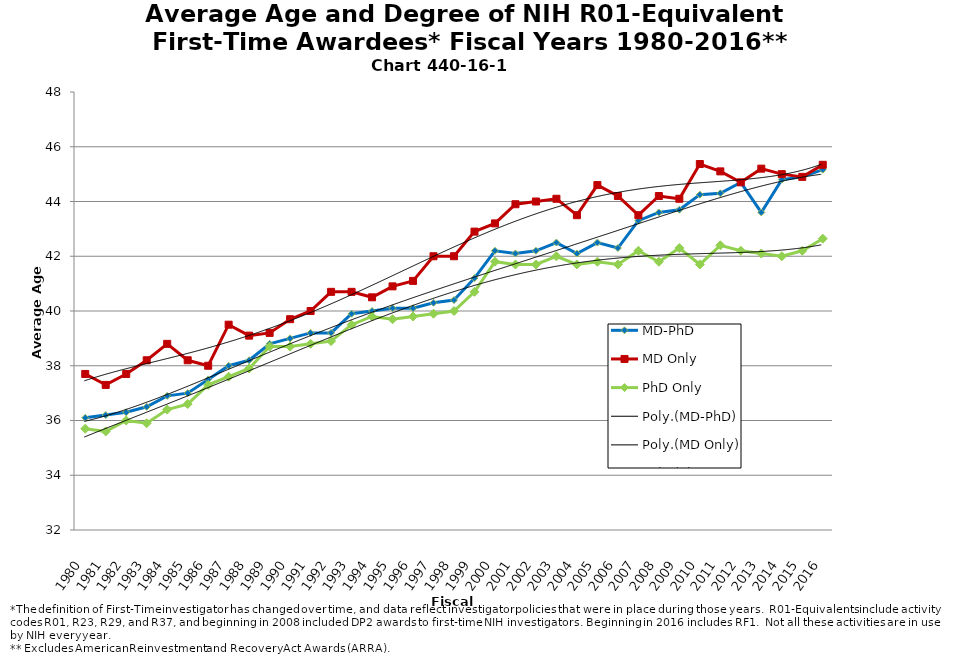
| Category | MD-PhD | MD Only | PhD Only |
|---|---|---|---|
| 1980.0 | 36.1 | 37.7 | 35.7 |
| 1981.0 | 36.2 | 37.3 | 35.6 |
| 1982.0 | 36.3 | 37.7 | 36 |
| 1983.0 | 36.5 | 38.2 | 35.9 |
| 1984.0 | 36.9 | 38.8 | 36.4 |
| 1985.0 | 37 | 38.2 | 36.6 |
| 1986.0 | 37.5 | 38 | 37.3 |
| 1987.0 | 38 | 39.5 | 37.6 |
| 1988.0 | 38.2 | 39.1 | 37.9 |
| 1989.0 | 38.8 | 39.2 | 38.7 |
| 1990.0 | 39 | 39.7 | 38.7 |
| 1991.0 | 39.2 | 40 | 38.8 |
| 1992.0 | 39.2 | 40.7 | 38.9 |
| 1993.0 | 39.9 | 40.7 | 39.5 |
| 1994.0 | 40 | 40.5 | 39.8 |
| 1995.0 | 40.1 | 40.9 | 39.7 |
| 1996.0 | 40.1 | 41.1 | 39.8 |
| 1997.0 | 40.3 | 42 | 39.9 |
| 1998.0 | 40.4 | 42 | 40 |
| 1999.0 | 41.2 | 42.9 | 40.7 |
| 2000.0 | 42.2 | 43.2 | 41.8 |
| 2001.0 | 42.1 | 43.9 | 41.7 |
| 2002.0 | 42.2 | 44 | 41.7 |
| 2003.0 | 42.5 | 44.1 | 42 |
| 2004.0 | 42.1 | 43.5 | 41.7 |
| 2005.0 | 42.5 | 44.6 | 41.8 |
| 2006.0 | 42.3 | 44.2 | 41.7 |
| 2007.0 | 43.3 | 43.5 | 42.2 |
| 2008.0 | 43.6 | 44.2 | 41.8 |
| 2009.0 | 43.7 | 44.1 | 42.3 |
| 2010.0 | 44.25 | 45.37 | 41.7 |
| 2011.0 | 44.3 | 45.1 | 42.4 |
| 2012.0 | 44.7 | 44.7 | 42.2 |
| 2013.0 | 43.6 | 45.2 | 42.1 |
| 2014.0 | 44.8 | 45 | 42 |
| 2015.0 | 44.9 | 44.9 | 42.2 |
| 2016.0 | 45.161 | 45.34 | 42.642 |